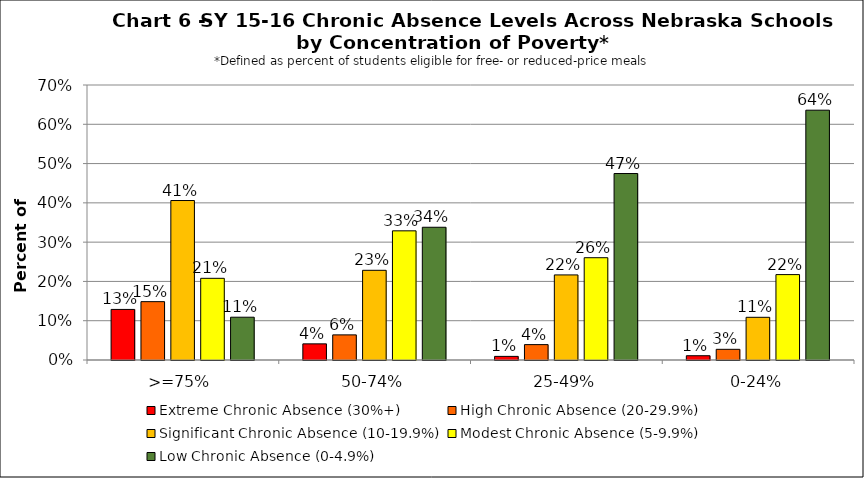
| Category | Extreme Chronic Absence (30%+) | High Chronic Absence (20-29.9%) | Significant Chronic Absence (10-19.9%) | Modest Chronic Absence (5-9.9%) | Low Chronic Absence (0-4.9%) |
|---|---|---|---|---|---|
| 0 | 0.129 | 0.149 | 0.406 | 0.208 | 0.109 |
| 1 | 0.041 | 0.064 | 0.228 | 0.329 | 0.338 |
| 2 | 0.009 | 0.039 | 0.217 | 0.26 | 0.475 |
| 3 | 0.011 | 0.027 | 0.109 | 0.217 | 0.636 |